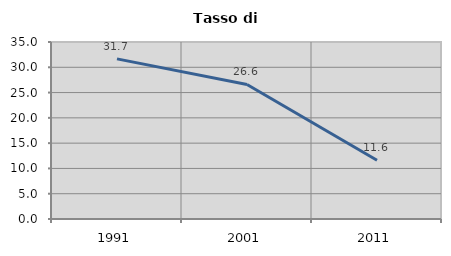
| Category | Tasso di disoccupazione   |
|---|---|
| 1991.0 | 31.667 |
| 2001.0 | 26.609 |
| 2011.0 | 11.625 |